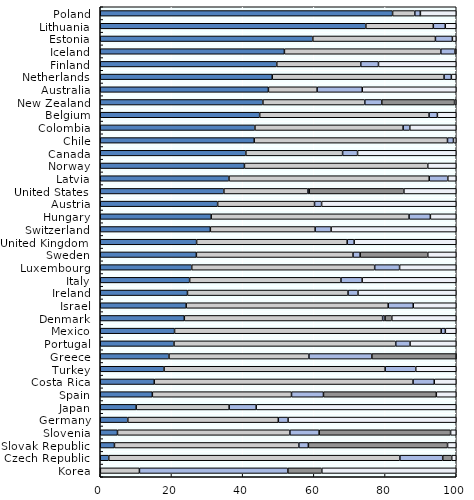
| Category | Equity | Bills and bonds | Cash and deposits | CIS (when look-through unavailable) | Other |
|---|---|---|---|---|---|
| Poland | 82.118 | 6.241 | 1.566 | 0 | 10.074 |
| Lithuania | 74.612 | 18.946 | 3.358 | 0 | 3.084 |
| Estonia | 59.712 | 34.441 | 4.76 | 0 | 1.088 |
| Iceland | 51.727 | 43.943 | 3.948 | 0 | 0.382 |
| Finland | 49.585 | 23.591 | 4.979 | 0 | 21.845 |
| Netherlands | 48.309 | 48.266 | 2.049 | 0 | 1.376 |
| Australia | 47.233 | 13.68 | 12.686 | 0 | 26.401 |
| New Zealand | 45.686 | 28.626 | 4.765 | 20.454 | 0.469 |
| Belgium | 44.785 | 47.578 | 2.336 | 0 | 5.301 |
| Colombia | 43.448 | 41.622 | 1.886 | 0 | 13.044 |
| Chile | 43.243 | 54.295 | 1.678 | 0 | 0.784 |
| Canada | 40.897 | 27.177 | 4.206 | 0 | 27.72 |
| Norway | 40.5 | 51.5 | 0 | 0 | 8 |
| Latvia | 36.16 | 56.248 | 5.223 | 0 | 2.369 |
| United States | 34.728 | 23.605 | 0.362 | 26.599 | 14.706 |
| Austria | 32.979 | 27.217 | 1.983 | 0 | 37.822 |
| Hungary | 31.159 | 55.583 | 5.985 | 0 | 7.272 |
| Switzerland | 30.924 | 29.435 | 4.488 | 0 | 35.152 |
| United Kingdom | 27.064 | 42.299 | 1.963 | 0 | 28.674 |
| Sweden | 27 | 44 | 2 | 19 | 8 |
| Luxembourg | 25.697 | 51.392 | 6.995 | 0 | 15.916 |
| Italy | 25.11 | 42.507 | 5.95 | 0 | 26.434 |
| Ireland | 24.5 | 45.1 | 2.8 | 0 | 27.6 |
| Israel | 24.139 | 56.744 | 7.036 | 0 | 12.081 |
| Denmark | 23.616 | 55.703 | 0.669 | 1.915 | 18.096 |
| Mexico | 20.872 | 74.906 | 1.158 | 0 | 3.064 |
| Portugal | 20.714 | 62.289 | 4.019 | 0 | 12.978 |
| Greece | 19.304 | 39.315 | 17.673 | 23.654 | 0.054 |
| Turkey | 17.925 | 62.103 | 8.596 | 0 | 11.376 |
| Costa Rica | 15.156 | 72.708 | 5.954 | 0 | 6.182 |
| Spain | 14.632 | 39.09 | 8.978 | 31.703 | 5.597 |
| Japan | 10.093 | 26.112 | 7.599 | 0 | 56.197 |
| Germany | 7.741 | 42.275 | 2.747 | 0 | 47.236 |
| Slovenia | 4.844 | 48.43 | 8.21 | 36.924 | 1.592 |
| Slovak Republic | 3.987 | 51.806 | 2.665 | 39.099 | 2.444 |
| Czech Republic | 2.39 | 81.777 | 12.029 | 2.538 | 1.267 |
| Korea | 0.027 | 10.979 | 41.69 | 9.541 | 37.763 |